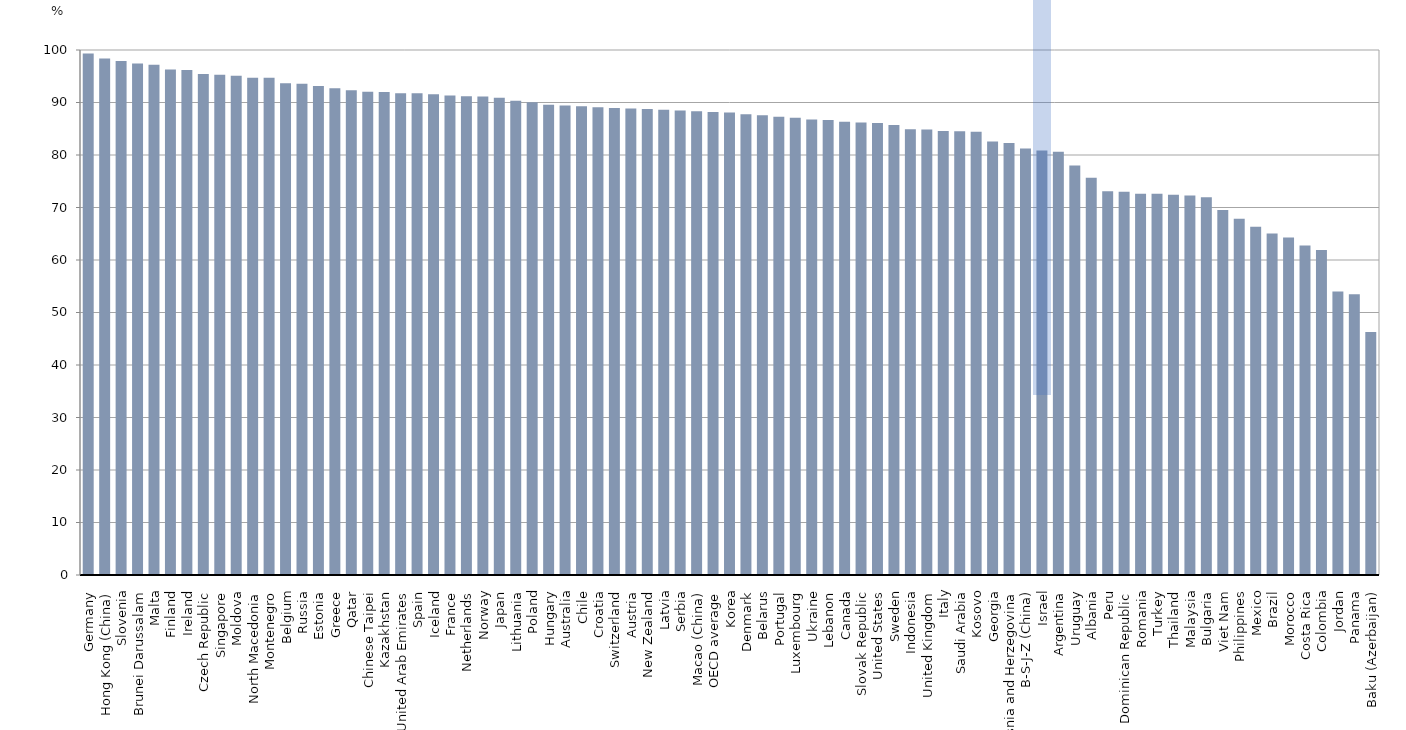
| Category | Coverage index 3 (coverage of 15-year-old population) |
|---|---|
| Germany | 99.341 |
| Hong Kong (China) | 98.394 |
| Slovenia | 97.928 |
| Brunei Darussalam | 97.43 |
| Malta | 97.177 |
| Finland | 96.309 |
| Ireland | 96.193 |
| Czech Republic | 95.43 |
| Singapore | 95.304 |
| Moldova | 95.073 |
| North Macedonia | 94.726 |
| Montenegro | 94.7 |
| Belgium | 93.647 |
| Russia | 93.574 |
| Estonia | 93.126 |
| Greece | 92.711 |
| Qatar | 92.336 |
| Chinese Taipei | 92.056 |
| Kazakhstan | 92.015 |
| United Arab Emirates | 91.78 |
| Spain | 91.751 |
| Iceland | 91.565 |
| France | 91.34 |
| Netherlands | 91.172 |
| Norway | 91.14 |
| Japan | 90.906 |
| Lithuania | 90.317 |
| Poland | 90.03 |
| Hungary | 89.586 |
| Australia | 89.446 |
| Chile | 89.286 |
| Croatia | 89.073 |
| Switzerland | 88.948 |
| Austria | 88.877 |
| New Zealand | 88.777 |
| Latvia | 88.627 |
| Serbia | 88.457 |
| Macao (China) | 88.349 |
| OECD average | 88.169 |
| Korea | 88.106 |
| Denmark | 87.783 |
| Belarus | 87.582 |
| Portugal | 87.299 |
| Luxembourg | 87.077 |
| Ukraine | 86.749 |
| Lebanon | 86.684 |
| Canada | 86.345 |
| Slovak Republic | 86.205 |
| United States | 86.098 |
| Sweden | 85.737 |
| Indonesia | 84.894 |
| United Kingdom | 84.836 |
| Italy | 84.589 |
| Saudi Arabia | 84.533 |
| Kosovo | 84.407 |
| Georgia | 82.586 |
| Bosnia and Herzegovina | 82.276 |
| B-S-J-Z (China) | 81.22 |
| Israel | 80.852 |
| Argentina | 80.605 |
| Uruguay | 77.987 |
| Albania | 75.667 |
| Peru | 73.118 |
| Dominican Republic | 73.013 |
| Romania | 72.618 |
| Turkey | 72.616 |
| Thailand | 72.405 |
| Malaysia | 72.264 |
| Bulgaria | 71.958 |
| Viet Nam | 69.539 |
| Philippines | 67.872 |
| Mexico | 66.356 |
| Brazil | 65.024 |
| Morocco | 64.267 |
| Costa Rica | 62.772 |
| Colombia | 61.907 |
| Jordan | 54.001 |
| Panama | 53.466 |
| Baku (Azerbaijan) | 46.283 |